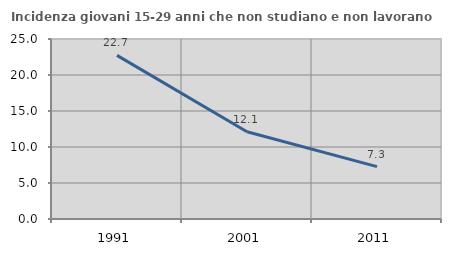
| Category | Incidenza giovani 15-29 anni che non studiano e non lavorano  |
|---|---|
| 1991.0 | 22.727 |
| 2001.0 | 12.121 |
| 2011.0 | 7.273 |